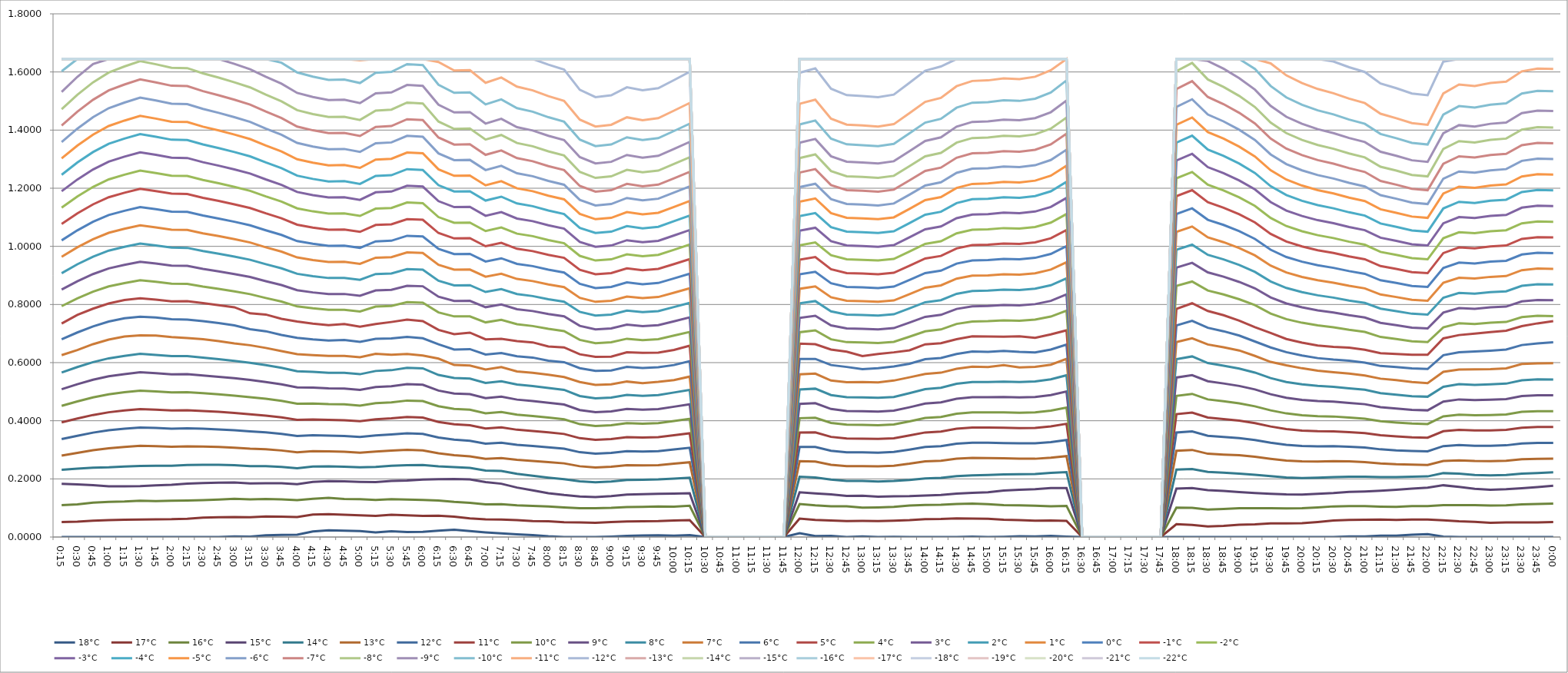
| Category | 18°C | 17°C | 16°C | 15°C | 14°C | 13°C | 12°C | 11°C | 10°C | 9°C | 8°C | 7°C | 6°C | 5°C | 4°C | 3°C | 2°C | 1°C | 0°C | -1°C | -2°C | -3°C | -4°C | -5°C | -6°C | -7°C | -8°C | -9°C | -10°C | -11°C | -12°C | -13°C | -14°C | -15°C | -16°C | -17°C | -18°C | -19°C | -20°C | -21°C | -22°C |
|---|---|---|---|---|---|---|---|---|---|---|---|---|---|---|---|---|---|---|---|---|---|---|---|---|---|---|---|---|---|---|---|---|---|---|---|---|---|---|---|---|---|
| 0.010416666666666666 | 0 | 0.052 | 0.11 | 0.183 | 0.231 | 0.28 | 0.337 | 0.394 | 0.451 | 0.509 | 0.566 | 0.626 | 0.68 | 0.734 | 0.794 | 0.851 | 0.908 | 0.964 | 1.021 | 1.077 | 1.133 | 1.19 | 1.246 | 1.303 | 1.359 | 1.416 | 1.472 | 1.531 | 1.602 | 1.644 | 1.644 | 1.644 | 1.644 | 1.644 | 1.644 | 1.644 | 1.644 | 1.644 | 1.644 | 1.644 | 1.644 |
| 0.0208333333333333 | 0 | 0.053 | 0.112 | 0.181 | 0.235 | 0.289 | 0.348 | 0.408 | 0.467 | 0.526 | 0.585 | 0.643 | 0.704 | 0.764 | 0.821 | 0.88 | 0.938 | 0.997 | 1.055 | 1.113 | 1.172 | 1.23 | 1.288 | 1.347 | 1.405 | 1.463 | 1.522 | 1.583 | 1.644 | 1.644 | 1.644 | 1.644 | 1.644 | 1.644 | 1.644 | 1.644 | 1.644 | 1.644 | 1.644 | 1.644 | 1.644 |
| 0.03125 | 0 | 0.056 | 0.118 | 0.179 | 0.239 | 0.299 | 0.359 | 0.42 | 0.48 | 0.541 | 0.602 | 0.664 | 0.725 | 0.786 | 0.844 | 0.905 | 0.965 | 1.025 | 1.085 | 1.145 | 1.205 | 1.265 | 1.324 | 1.384 | 1.444 | 1.504 | 1.564 | 1.628 | 1.644 | 1.644 | 1.644 | 1.644 | 1.644 | 1.644 | 1.644 | 1.644 | 1.644 | 1.644 | 1.644 | 1.644 | 1.644 |
| 0.0416666666666667 | 0 | 0.058 | 0.121 | 0.174 | 0.24 | 0.306 | 0.367 | 0.429 | 0.491 | 0.553 | 0.615 | 0.679 | 0.741 | 0.804 | 0.862 | 0.924 | 0.985 | 1.047 | 1.108 | 1.169 | 1.23 | 1.292 | 1.353 | 1.414 | 1.475 | 1.537 | 1.598 | 1.644 | 1.644 | 1.644 | 1.644 | 1.644 | 1.644 | 1.644 | 1.644 | 1.644 | 1.644 | 1.644 | 1.644 | 1.644 | 1.644 |
| 0.0520833333333333 | 0 | 0.06 | 0.122 | 0.175 | 0.243 | 0.31 | 0.373 | 0.435 | 0.498 | 0.561 | 0.623 | 0.69 | 0.753 | 0.815 | 0.874 | 0.936 | 0.998 | 1.06 | 1.122 | 1.184 | 1.247 | 1.309 | 1.371 | 1.433 | 1.495 | 1.557 | 1.619 | 1.644 | 1.644 | 1.644 | 1.644 | 1.644 | 1.644 | 1.644 | 1.644 | 1.644 | 1.644 | 1.644 | 1.644 | 1.644 | 1.644 |
| 0.0625 | 0 | 0.06 | 0.125 | 0.175 | 0.245 | 0.314 | 0.377 | 0.44 | 0.504 | 0.567 | 0.63 | 0.694 | 0.758 | 0.821 | 0.884 | 0.947 | 1.01 | 1.072 | 1.135 | 1.198 | 1.261 | 1.324 | 1.386 | 1.449 | 1.512 | 1.575 | 1.637 | 1.644 | 1.644 | 1.644 | 1.644 | 1.644 | 1.644 | 1.644 | 1.644 | 1.644 | 1.644 | 1.644 | 1.644 | 1.644 | 1.644 |
| 0.0729166666666667 | 0 | 0.061 | 0.124 | 0.178 | 0.245 | 0.312 | 0.375 | 0.438 | 0.501 | 0.564 | 0.627 | 0.693 | 0.755 | 0.817 | 0.878 | 0.941 | 1.003 | 1.065 | 1.128 | 1.19 | 1.252 | 1.315 | 1.377 | 1.44 | 1.502 | 1.564 | 1.627 | 1.644 | 1.644 | 1.644 | 1.644 | 1.644 | 1.644 | 1.644 | 1.644 | 1.644 | 1.644 | 1.644 | 1.644 | 1.644 | 1.644 |
| 0.0833333333333333 | 0 | 0.061 | 0.125 | 0.18 | 0.245 | 0.311 | 0.373 | 0.435 | 0.498 | 0.56 | 0.622 | 0.688 | 0.749 | 0.811 | 0.871 | 0.934 | 0.996 | 1.057 | 1.119 | 1.181 | 1.243 | 1.305 | 1.367 | 1.429 | 1.491 | 1.553 | 1.614 | 1.644 | 1.644 | 1.644 | 1.644 | 1.644 | 1.644 | 1.644 | 1.644 | 1.644 | 1.644 | 1.644 | 1.644 | 1.644 | 1.644 |
| 0.09375 | 0 | 0.063 | 0.126 | 0.184 | 0.248 | 0.312 | 0.374 | 0.436 | 0.498 | 0.56 | 0.622 | 0.685 | 0.748 | 0.811 | 0.871 | 0.933 | 0.995 | 1.057 | 1.118 | 1.18 | 1.242 | 1.304 | 1.366 | 1.428 | 1.49 | 1.551 | 1.613 | 1.644 | 1.644 | 1.644 | 1.644 | 1.644 | 1.644 | 1.644 | 1.644 | 1.644 | 1.644 | 1.644 | 1.644 | 1.644 | 1.644 |
| 0.104166666666667 | 0 | 0.067 | 0.127 | 0.186 | 0.249 | 0.311 | 0.372 | 0.434 | 0.495 | 0.556 | 0.617 | 0.68 | 0.743 | 0.805 | 0.861 | 0.923 | 0.984 | 1.045 | 1.106 | 1.167 | 1.228 | 1.289 | 1.351 | 1.412 | 1.473 | 1.534 | 1.595 | 1.644 | 1.644 | 1.644 | 1.644 | 1.644 | 1.644 | 1.644 | 1.644 | 1.644 | 1.644 | 1.644 | 1.644 | 1.644 | 1.644 |
| 0.114583333333333 | 0 | 0.068 | 0.129 | 0.187 | 0.248 | 0.31 | 0.37 | 0.431 | 0.491 | 0.551 | 0.612 | 0.674 | 0.736 | 0.798 | 0.854 | 0.914 | 0.975 | 1.035 | 1.096 | 1.156 | 1.217 | 1.278 | 1.338 | 1.399 | 1.459 | 1.52 | 1.581 | 1.644 | 1.644 | 1.644 | 1.644 | 1.644 | 1.644 | 1.644 | 1.644 | 1.644 | 1.644 | 1.644 | 1.644 | 1.644 | 1.644 |
| 0.125 | 0.002 | 0.068 | 0.131 | 0.188 | 0.247 | 0.307 | 0.367 | 0.427 | 0.487 | 0.546 | 0.606 | 0.666 | 0.728 | 0.791 | 0.845 | 0.905 | 0.965 | 1.025 | 1.085 | 1.145 | 1.205 | 1.265 | 1.325 | 1.385 | 1.445 | 1.505 | 1.565 | 1.628 | 1.644 | 1.644 | 1.644 | 1.644 | 1.644 | 1.644 | 1.644 | 1.644 | 1.644 | 1.644 | 1.644 | 1.644 | 1.644 |
| 0.135416666666667 | 0.001 | 0.068 | 0.13 | 0.184 | 0.244 | 0.304 | 0.363 | 0.422 | 0.481 | 0.54 | 0.599 | 0.66 | 0.715 | 0.77 | 0.836 | 0.895 | 0.954 | 1.013 | 1.073 | 1.132 | 1.191 | 1.25 | 1.31 | 1.369 | 1.428 | 1.488 | 1.547 | 1.609 | 1.644 | 1.644 | 1.644 | 1.644 | 1.644 | 1.644 | 1.644 | 1.644 | 1.644 | 1.644 | 1.644 | 1.644 | 1.644 |
| 0.145833333333333 | 0.006 | 0.071 | 0.131 | 0.185 | 0.244 | 0.302 | 0.36 | 0.418 | 0.476 | 0.533 | 0.591 | 0.651 | 0.708 | 0.765 | 0.822 | 0.88 | 0.939 | 0.997 | 1.055 | 1.114 | 1.172 | 1.23 | 1.289 | 1.347 | 1.405 | 1.464 | 1.522 | 1.584 | 1.644 | 1.644 | 1.644 | 1.644 | 1.644 | 1.644 | 1.644 | 1.644 | 1.644 | 1.644 | 1.644 | 1.644 | 1.644 |
| 0.15625 | 0.008 | 0.07 | 0.129 | 0.185 | 0.241 | 0.298 | 0.355 | 0.412 | 0.469 | 0.525 | 0.582 | 0.64 | 0.695 | 0.751 | 0.81 | 0.867 | 0.924 | 0.982 | 1.039 | 1.097 | 1.154 | 1.212 | 1.269 | 1.327 | 1.384 | 1.442 | 1.499 | 1.56 | 1.632 | 1.644 | 1.644 | 1.644 | 1.644 | 1.644 | 1.644 | 1.644 | 1.644 | 1.644 | 1.644 | 1.644 | 1.644 |
| 0.166666666666667 | 0.008 | 0.069 | 0.127 | 0.182 | 0.237 | 0.292 | 0.347 | 0.403 | 0.459 | 0.515 | 0.57 | 0.629 | 0.685 | 0.741 | 0.793 | 0.849 | 0.906 | 0.962 | 1.018 | 1.074 | 1.131 | 1.187 | 1.243 | 1.3 | 1.356 | 1.412 | 1.468 | 1.528 | 1.598 | 1.644 | 1.644 | 1.644 | 1.644 | 1.644 | 1.644 | 1.644 | 1.644 | 1.644 | 1.644 | 1.644 | 1.644 |
| 0.177083333333333 | 0.019 | 0.077 | 0.132 | 0.19 | 0.242 | 0.295 | 0.35 | 0.405 | 0.459 | 0.514 | 0.568 | 0.626 | 0.68 | 0.734 | 0.787 | 0.842 | 0.897 | 0.953 | 1.009 | 1.065 | 1.12 | 1.176 | 1.232 | 1.288 | 1.344 | 1.399 | 1.455 | 1.514 | 1.584 | 1.644 | 1.644 | 1.644 | 1.644 | 1.644 | 1.644 | 1.644 | 1.644 | 1.644 | 1.644 | 1.644 | 1.644 |
| 0.1875 | 0.023 | 0.079 | 0.135 | 0.192 | 0.243 | 0.295 | 0.349 | 0.403 | 0.457 | 0.511 | 0.565 | 0.623 | 0.676 | 0.729 | 0.782 | 0.836 | 0.891 | 0.946 | 1.002 | 1.057 | 1.113 | 1.168 | 1.223 | 1.279 | 1.334 | 1.39 | 1.445 | 1.503 | 1.573 | 1.644 | 1.644 | 1.644 | 1.644 | 1.644 | 1.644 | 1.644 | 1.644 | 1.644 | 1.644 | 1.644 | 1.644 |
| 0.197916666666667 | 0.022 | 0.077 | 0.131 | 0.191 | 0.242 | 0.293 | 0.348 | 0.402 | 0.456 | 0.511 | 0.565 | 0.623 | 0.678 | 0.733 | 0.782 | 0.836 | 0.892 | 0.947 | 1.003 | 1.058 | 1.113 | 1.169 | 1.224 | 1.28 | 1.335 | 1.391 | 1.446 | 1.504 | 1.574 | 1.644 | 1.644 | 1.644 | 1.644 | 1.644 | 1.644 | 1.644 | 1.644 | 1.644 | 1.644 | 1.644 | 1.644 |
| 0.208333333333333 | 0.02 | 0.075 | 0.13 | 0.19 | 0.24 | 0.29 | 0.344 | 0.398 | 0.452 | 0.506 | 0.56 | 0.619 | 0.671 | 0.724 | 0.776 | 0.83 | 0.885 | 0.94 | 0.995 | 1.05 | 1.105 | 1.16 | 1.215 | 1.27 | 1.325 | 1.38 | 1.435 | 1.493 | 1.562 | 1.64 | 1.644 | 1.644 | 1.644 | 1.644 | 1.644 | 1.644 | 1.644 | 1.644 | 1.644 | 1.644 | 1.644 |
| 0.21875 | 0.016 | 0.072 | 0.128 | 0.189 | 0.241 | 0.294 | 0.35 | 0.405 | 0.46 | 0.516 | 0.571 | 0.631 | 0.682 | 0.733 | 0.793 | 0.849 | 0.905 | 0.961 | 1.017 | 1.074 | 1.13 | 1.186 | 1.242 | 1.299 | 1.355 | 1.411 | 1.467 | 1.527 | 1.597 | 1.644 | 1.644 | 1.644 | 1.644 | 1.644 | 1.644 | 1.644 | 1.644 | 1.644 | 1.644 | 1.644 | 1.644 |
| 0.229166666666667 | 0.02 | 0.077 | 0.13 | 0.193 | 0.245 | 0.298 | 0.353 | 0.408 | 0.463 | 0.519 | 0.574 | 0.627 | 0.683 | 0.74 | 0.795 | 0.85 | 0.907 | 0.963 | 1.019 | 1.076 | 1.132 | 1.188 | 1.245 | 1.301 | 1.358 | 1.414 | 1.47 | 1.53 | 1.6 | 1.644 | 1.644 | 1.644 | 1.644 | 1.644 | 1.644 | 1.644 | 1.644 | 1.644 | 1.644 | 1.644 | 1.644 |
| 0.239583333333333 | 0.017 | 0.075 | 0.129 | 0.194 | 0.247 | 0.3 | 0.357 | 0.413 | 0.469 | 0.526 | 0.582 | 0.629 | 0.689 | 0.748 | 0.808 | 0.864 | 0.922 | 0.979 | 1.036 | 1.094 | 1.151 | 1.208 | 1.266 | 1.323 | 1.38 | 1.437 | 1.495 | 1.555 | 1.627 | 1.644 | 1.644 | 1.644 | 1.644 | 1.644 | 1.644 | 1.644 | 1.644 | 1.644 | 1.644 | 1.644 | 1.644 |
| 0.25 | 0.018 | 0.073 | 0.127 | 0.197 | 0.248 | 0.298 | 0.355 | 0.411 | 0.468 | 0.524 | 0.58 | 0.625 | 0.684 | 0.743 | 0.806 | 0.863 | 0.92 | 0.977 | 1.034 | 1.091 | 1.149 | 1.206 | 1.263 | 1.32 | 1.377 | 1.435 | 1.492 | 1.552 | 1.624 | 1.644 | 1.644 | 1.644 | 1.644 | 1.644 | 1.644 | 1.644 | 1.644 | 1.644 | 1.644 | 1.644 | 1.644 |
| 0.260416666666667 | 0.022 | 0.073 | 0.126 | 0.199 | 0.243 | 0.288 | 0.342 | 0.396 | 0.45 | 0.504 | 0.558 | 0.614 | 0.663 | 0.713 | 0.773 | 0.827 | 0.882 | 0.936 | 0.991 | 1.046 | 1.101 | 1.156 | 1.21 | 1.265 | 1.32 | 1.375 | 1.43 | 1.487 | 1.556 | 1.634 | 1.644 | 1.644 | 1.644 | 1.644 | 1.644 | 1.644 | 1.644 | 1.644 | 1.644 | 1.644 | 1.644 |
| 0.270833333333333 | 0.025 | 0.07 | 0.121 | 0.2 | 0.24 | 0.282 | 0.335 | 0.388 | 0.441 | 0.494 | 0.547 | 0.592 | 0.645 | 0.698 | 0.759 | 0.812 | 0.866 | 0.92 | 0.974 | 1.027 | 1.081 | 1.135 | 1.189 | 1.243 | 1.296 | 1.35 | 1.404 | 1.461 | 1.528 | 1.605 | 1.644 | 1.644 | 1.644 | 1.644 | 1.644 | 1.644 | 1.644 | 1.644 | 1.644 | 1.644 | 1.644 |
| 0.28125 | 0.02 | 0.064 | 0.117 | 0.198 | 0.238 | 0.278 | 0.331 | 0.385 | 0.438 | 0.492 | 0.545 | 0.59 | 0.646 | 0.703 | 0.759 | 0.813 | 0.867 | 0.92 | 0.974 | 1.028 | 1.082 | 1.136 | 1.19 | 1.244 | 1.297 | 1.351 | 1.405 | 1.462 | 1.53 | 1.606 | 1.644 | 1.644 | 1.644 | 1.644 | 1.644 | 1.644 | 1.644 | 1.644 | 1.644 | 1.644 | 1.644 |
| 0.291666666666667 | 0.016 | 0.061 | 0.113 | 0.189 | 0.229 | 0.269 | 0.321 | 0.373 | 0.426 | 0.478 | 0.53 | 0.576 | 0.628 | 0.68 | 0.739 | 0.791 | 0.843 | 0.896 | 0.948 | 1 | 1.053 | 1.105 | 1.158 | 1.21 | 1.262 | 1.315 | 1.367 | 1.423 | 1.488 | 1.563 | 1.644 | 1.644 | 1.644 | 1.644 | 1.644 | 1.644 | 1.644 | 1.644 | 1.644 | 1.644 | 1.644 |
| 0.302083333333333 | 0.012 | 0.06 | 0.113 | 0.183 | 0.227 | 0.271 | 0.324 | 0.377 | 0.43 | 0.483 | 0.536 | 0.584 | 0.633 | 0.682 | 0.747 | 0.8 | 0.853 | 0.906 | 0.959 | 1.012 | 1.065 | 1.118 | 1.171 | 1.224 | 1.277 | 1.33 | 1.383 | 1.439 | 1.506 | 1.581 | 1.644 | 1.644 | 1.644 | 1.644 | 1.644 | 1.644 | 1.644 | 1.644 | 1.644 | 1.644 | 1.644 |
| 0.3125 | 0.01 | 0.058 | 0.109 | 0.17 | 0.218 | 0.265 | 0.317 | 0.369 | 0.421 | 0.473 | 0.525 | 0.57 | 0.622 | 0.674 | 0.732 | 0.784 | 0.836 | 0.888 | 0.94 | 0.992 | 1.044 | 1.096 | 1.148 | 1.2 | 1.252 | 1.304 | 1.355 | 1.41 | 1.475 | 1.549 | 1.644 | 1.644 | 1.644 | 1.644 | 1.644 | 1.644 | 1.644 | 1.644 | 1.644 | 1.644 | 1.644 |
| 0.322916666666667 | 0.007 | 0.055 | 0.107 | 0.161 | 0.211 | 0.262 | 0.313 | 0.365 | 0.416 | 0.468 | 0.519 | 0.565 | 0.617 | 0.67 | 0.726 | 0.777 | 0.829 | 0.881 | 0.932 | 0.984 | 1.035 | 1.087 | 1.138 | 1.19 | 1.241 | 1.293 | 1.344 | 1.399 | 1.463 | 1.537 | 1.644 | 1.644 | 1.644 | 1.644 | 1.644 | 1.644 | 1.644 | 1.644 | 1.644 | 1.644 | 1.644 |
| 0.333333333333333 | 0.002 | 0.054 | 0.105 | 0.151 | 0.204 | 0.258 | 0.309 | 0.36 | 0.411 | 0.462 | 0.513 | 0.558 | 0.607 | 0.655 | 0.716 | 0.767 | 0.818 | 0.869 | 0.92 | 0.971 | 1.022 | 1.073 | 1.123 | 1.174 | 1.225 | 1.276 | 1.327 | 1.381 | 1.444 | 1.517 | 1.625 | 1.644 | 1.644 | 1.644 | 1.644 | 1.644 | 1.644 | 1.644 | 1.644 | 1.644 | 1.644 |
| 0.34375 | 0 | 0.051 | 0.102 | 0.144 | 0.199 | 0.253 | 0.304 | 0.355 | 0.405 | 0.456 | 0.506 | 0.55 | 0.601 | 0.652 | 0.709 | 0.759 | 0.809 | 0.86 | 0.91 | 0.96 | 1.011 | 1.061 | 1.111 | 1.162 | 1.212 | 1.262 | 1.313 | 1.366 | 1.429 | 1.5 | 1.608 | 1.644 | 1.644 | 1.644 | 1.644 | 1.644 | 1.644 | 1.644 | 1.644 | 1.644 | 1.644 |
| 0.354166666666667 | 0 | 0.05 | 0.099 | 0.14 | 0.192 | 0.243 | 0.292 | 0.34 | 0.388 | 0.437 | 0.485 | 0.533 | 0.581 | 0.629 | 0.678 | 0.727 | 0.775 | 0.823 | 0.871 | 0.919 | 0.967 | 1.015 | 1.064 | 1.112 | 1.16 | 1.208 | 1.256 | 1.307 | 1.367 | 1.436 | 1.539 | 1.644 | 1.644 | 1.644 | 1.644 | 1.644 | 1.644 | 1.644 | 1.644 | 1.644 | 1.644 |
| 0.364583333333333 | 0 | 0.049 | 0.099 | 0.138 | 0.189 | 0.239 | 0.287 | 0.334 | 0.382 | 0.429 | 0.477 | 0.523 | 0.572 | 0.62 | 0.667 | 0.714 | 0.762 | 0.809 | 0.857 | 0.904 | 0.951 | 0.999 | 1.046 | 1.093 | 1.141 | 1.188 | 1.235 | 1.285 | 1.345 | 1.412 | 1.513 | 1.644 | 1.644 | 1.644 | 1.644 | 1.644 | 1.644 | 1.644 | 1.644 | 1.644 | 1.644 |
| 0.375 | 0.001 | 0.051 | 0.1 | 0.141 | 0.191 | 0.242 | 0.289 | 0.337 | 0.384 | 0.432 | 0.48 | 0.525 | 0.573 | 0.621 | 0.67 | 0.718 | 0.765 | 0.813 | 0.86 | 0.908 | 0.955 | 1.003 | 1.05 | 1.098 | 1.146 | 1.193 | 1.241 | 1.291 | 1.351 | 1.418 | 1.52 | 1.644 | 1.644 | 1.644 | 1.644 | 1.644 | 1.644 | 1.644 | 1.644 | 1.644 | 1.644 |
| 0.385416666666667 | 0.004 | 0.054 | 0.103 | 0.146 | 0.196 | 0.247 | 0.295 | 0.344 | 0.392 | 0.44 | 0.489 | 0.535 | 0.585 | 0.636 | 0.682 | 0.731 | 0.779 | 0.827 | 0.876 | 0.924 | 0.973 | 1.021 | 1.07 | 1.118 | 1.166 | 1.215 | 1.263 | 1.314 | 1.375 | 1.444 | 1.547 | 1.644 | 1.644 | 1.644 | 1.644 | 1.644 | 1.644 | 1.644 | 1.644 | 1.644 | 1.644 |
| 0.395833333333333 | 0.005 | 0.054 | 0.104 | 0.147 | 0.197 | 0.246 | 0.294 | 0.342 | 0.39 | 0.438 | 0.486 | 0.53 | 0.582 | 0.634 | 0.678 | 0.726 | 0.774 | 0.822 | 0.87 | 0.918 | 0.966 | 1.014 | 1.062 | 1.11 | 1.158 | 1.206 | 1.255 | 1.305 | 1.366 | 1.434 | 1.537 | 1.644 | 1.644 | 1.644 | 1.644 | 1.644 | 1.644 | 1.644 | 1.644 | 1.644 | 1.644 |
| 0.40625 | 0.006 | 0.055 | 0.105 | 0.149 | 0.198 | 0.247 | 0.296 | 0.344 | 0.392 | 0.44 | 0.488 | 0.534 | 0.584 | 0.634 | 0.681 | 0.729 | 0.777 | 0.826 | 0.874 | 0.922 | 0.971 | 1.019 | 1.067 | 1.116 | 1.164 | 1.212 | 1.261 | 1.312 | 1.372 | 1.441 | 1.544 | 1.644 | 1.644 | 1.644 | 1.644 | 1.644 | 1.644 | 1.644 | 1.644 | 1.644 | 1.644 |
| 0.416666666666667 | 0.005 | 0.057 | 0.104 | 0.15 | 0.201 | 0.252 | 0.301 | 0.35 | 0.399 | 0.448 | 0.497 | 0.54 | 0.592 | 0.644 | 0.693 | 0.742 | 0.791 | 0.841 | 0.89 | 0.939 | 0.988 | 1.037 | 1.087 | 1.136 | 1.185 | 1.234 | 1.283 | 1.335 | 1.397 | 1.467 | 1.572 | 1.644 | 1.644 | 1.644 | 1.644 | 1.644 | 1.644 | 1.644 | 1.644 | 1.644 | 1.644 |
| 0.427083333333333 | 0.006 | 0.058 | 0.108 | 0.151 | 0.204 | 0.257 | 0.307 | 0.357 | 0.407 | 0.457 | 0.506 | 0.552 | 0.605 | 0.658 | 0.706 | 0.756 | 0.806 | 0.856 | 0.906 | 0.956 | 1.006 | 1.056 | 1.106 | 1.156 | 1.206 | 1.256 | 1.306 | 1.359 | 1.422 | 1.493 | 1.6 | 1.644 | 1.644 | 1.644 | 1.644 | 1.644 | 1.644 | 1.644 | 1.644 | 1.644 | 1.644 |
| 0.4375 | 0 | 0 | 0 | 0 | 0 | 0 | 0 | 0 | 0 | 0 | 0 | 0 | 0 | 0 | 0 | 0 | 0 | 0 | 0 | 0 | 0 | 0 | 0 | 0 | 0 | 0 | 0 | 0 | 0 | 0 | 0 | 0 | 0 | 0 | 0 | 0 | 0 | 0 | 0 | 0 | 0 |
| 0.447916666666667 | 0 | 0 | 0 | 0 | 0 | 0 | 0 | 0 | 0 | 0 | 0 | 0 | 0 | 0 | 0 | 0 | 0 | 0 | 0 | 0 | 0 | 0 | 0 | 0 | 0 | 0 | 0 | 0 | 0 | 0 | 0 | 0 | 0 | 0 | 0 | 0 | 0 | 0 | 0 | 0 | 0 |
| 0.458333333333333 | 0 | 0 | 0 | 0 | 0 | 0 | 0 | 0 | 0 | 0 | 0 | 0 | 0 | 0 | 0 | 0 | 0 | 0 | 0 | 0 | 0 | 0 | 0 | 0 | 0 | 0 | 0 | 0 | 0 | 0 | 0 | 0 | 0 | 0 | 0 | 0 | 0 | 0 | 0 | 0 | 0 |
| 0.46875 | 0 | 0 | 0 | 0 | 0 | 0 | 0 | 0 | 0 | 0 | 0 | 0 | 0 | 0 | 0 | 0 | 0 | 0 | 0 | 0 | 0 | 0 | 0 | 0 | 0 | 0 | 0 | 0 | 0 | 0 | 0 | 0 | 0 | 0 | 0 | 0 | 0 | 0 | 0 | 0 | 0 |
| 0.479166666666667 | 0 | 0 | 0 | 0 | 0 | 0 | 0 | 0 | 0 | 0 | 0 | 0 | 0 | 0 | 0 | 0 | 0 | 0 | 0 | 0 | 0 | 0 | 0 | 0 | 0 | 0 | 0 | 0 | 0 | 0 | 0 | 0 | 0 | 0 | 0 | 0 | 0 | 0 | 0 | 0 | 0 |
| 0.489583333333333 | 0 | 0 | 0 | 0 | 0 | 0 | 0 | 0 | 0 | 0 | 0 | 0 | 0 | 0 | 0 | 0 | 0 | 0 | 0 | 0 | 0 | 0 | 0 | 0 | 0 | 0 | 0 | 0 | 0 | 0 | 0 | 0 | 0 | 0 | 0 | 0 | 0 | 0 | 0 | 0 | 0 |
| 0.5 | 0.013 | 0.064 | 0.113 | 0.154 | 0.207 | 0.261 | 0.31 | 0.359 | 0.409 | 0.458 | 0.507 | 0.56 | 0.613 | 0.665 | 0.705 | 0.754 | 0.804 | 0.854 | 0.904 | 0.954 | 1.004 | 1.054 | 1.104 | 1.154 | 1.204 | 1.254 | 1.304 | 1.357 | 1.419 | 1.49 | 1.597 | 1.644 | 1.644 | 1.644 | 1.644 | 1.644 | 1.644 | 1.644 | 1.644 | 1.644 | 1.644 |
| 0.510416666666667 | 0.003 | 0.059 | 0.109 | 0.15 | 0.205 | 0.26 | 0.31 | 0.36 | 0.41 | 0.46 | 0.51 | 0.562 | 0.613 | 0.663 | 0.711 | 0.761 | 0.812 | 0.862 | 0.913 | 0.963 | 1.014 | 1.064 | 1.114 | 1.165 | 1.215 | 1.266 | 1.316 | 1.37 | 1.433 | 1.505 | 1.612 | 1.644 | 1.644 | 1.644 | 1.644 | 1.644 | 1.644 | 1.644 | 1.644 | 1.644 | 1.644 |
| 0.520833333333333 | 0.004 | 0.057 | 0.106 | 0.147 | 0.198 | 0.249 | 0.297 | 0.345 | 0.393 | 0.441 | 0.488 | 0.539 | 0.592 | 0.645 | 0.68 | 0.728 | 0.776 | 0.825 | 0.873 | 0.921 | 0.97 | 1.018 | 1.066 | 1.114 | 1.163 | 1.211 | 1.259 | 1.31 | 1.371 | 1.439 | 1.542 | 1.644 | 1.644 | 1.644 | 1.644 | 1.644 | 1.644 | 1.644 | 1.644 | 1.644 | 1.644 |
| 0.53125 | 0 | 0.055 | 0.106 | 0.141 | 0.193 | 0.244 | 0.292 | 0.339 | 0.386 | 0.434 | 0.481 | 0.533 | 0.585 | 0.638 | 0.67 | 0.718 | 0.765 | 0.813 | 0.861 | 0.908 | 0.956 | 1.003 | 1.051 | 1.098 | 1.146 | 1.194 | 1.241 | 1.291 | 1.351 | 1.419 | 1.52 | 1.644 | 1.644 | 1.644 | 1.644 | 1.644 | 1.644 | 1.644 | 1.644 | 1.644 | 1.644 |
| 0.541666666666667 | 0.002 | 0.055 | 0.101 | 0.142 | 0.193 | 0.244 | 0.291 | 0.339 | 0.386 | 0.433 | 0.48 | 0.533 | 0.578 | 0.622 | 0.669 | 0.716 | 0.764 | 0.811 | 0.859 | 0.906 | 0.954 | 1.001 | 1.049 | 1.096 | 1.144 | 1.191 | 1.239 | 1.289 | 1.348 | 1.416 | 1.517 | 1.644 | 1.644 | 1.644 | 1.644 | 1.644 | 1.644 | 1.644 | 1.644 | 1.644 | 1.644 |
| 0.552083333333333 | 0 | 0.055 | 0.102 | 0.139 | 0.191 | 0.243 | 0.29 | 0.337 | 0.385 | 0.432 | 0.479 | 0.532 | 0.581 | 0.63 | 0.667 | 0.715 | 0.762 | 0.809 | 0.857 | 0.904 | 0.951 | 0.999 | 1.046 | 1.093 | 1.141 | 1.188 | 1.236 | 1.285 | 1.345 | 1.412 | 1.513 | 1.644 | 1.644 | 1.644 | 1.644 | 1.644 | 1.644 | 1.644 | 1.644 | 1.644 | 1.644 |
| 0.5625 | 0.001 | 0.056 | 0.104 | 0.14 | 0.193 | 0.245 | 0.293 | 0.34 | 0.387 | 0.435 | 0.482 | 0.538 | 0.587 | 0.635 | 0.671 | 0.719 | 0.766 | 0.814 | 0.862 | 0.909 | 0.957 | 1.004 | 1.052 | 1.1 | 1.147 | 1.195 | 1.243 | 1.293 | 1.353 | 1.42 | 1.522 | 1.644 | 1.644 | 1.644 | 1.644 | 1.644 | 1.644 | 1.644 | 1.644 | 1.644 | 1.644 |
| 0.572916666666667 | 0 | 0.058 | 0.108 | 0.141 | 0.197 | 0.252 | 0.301 | 0.349 | 0.398 | 0.446 | 0.495 | 0.549 | 0.596 | 0.642 | 0.689 | 0.738 | 0.787 | 0.836 | 0.885 | 0.933 | 0.982 | 1.031 | 1.08 | 1.129 | 1.178 | 1.227 | 1.276 | 1.327 | 1.389 | 1.458 | 1.563 | 1.644 | 1.644 | 1.644 | 1.644 | 1.644 | 1.644 | 1.644 | 1.644 | 1.644 | 1.644 |
| 0.583333333333333 | 0 | 0.062 | 0.11 | 0.142 | 0.202 | 0.26 | 0.31 | 0.36 | 0.41 | 0.459 | 0.509 | 0.561 | 0.612 | 0.663 | 0.708 | 0.757 | 0.808 | 0.858 | 0.908 | 0.958 | 1.008 | 1.059 | 1.109 | 1.159 | 1.209 | 1.26 | 1.31 | 1.363 | 1.426 | 1.497 | 1.604 | 1.644 | 1.644 | 1.644 | 1.644 | 1.644 | 1.644 | 1.644 | 1.644 | 1.644 | 1.644 |
| 0.59375 | 0 | 0.062 | 0.111 | 0.145 | 0.204 | 0.262 | 0.313 | 0.363 | 0.413 | 0.463 | 0.513 | 0.565 | 0.616 | 0.667 | 0.714 | 0.764 | 0.815 | 0.866 | 0.916 | 0.967 | 1.018 | 1.068 | 1.119 | 1.17 | 1.22 | 1.271 | 1.322 | 1.375 | 1.439 | 1.511 | 1.619 | 1.644 | 1.644 | 1.644 | 1.644 | 1.644 | 1.644 | 1.644 | 1.644 | 1.644 | 1.644 |
| 0.604166666666667 | 0 | 0.064 | 0.113 | 0.149 | 0.21 | 0.27 | 0.321 | 0.373 | 0.424 | 0.476 | 0.527 | 0.579 | 0.63 | 0.681 | 0.733 | 0.785 | 0.837 | 0.889 | 0.941 | 0.993 | 1.045 | 1.097 | 1.149 | 1.201 | 1.253 | 1.305 | 1.357 | 1.412 | 1.477 | 1.551 | 1.644 | 1.644 | 1.644 | 1.644 | 1.644 | 1.644 | 1.644 | 1.644 | 1.644 | 1.644 | 1.644 |
| 0.614583333333333 | 0.001 | 0.063 | 0.115 | 0.152 | 0.212 | 0.272 | 0.324 | 0.376 | 0.429 | 0.481 | 0.533 | 0.586 | 0.638 | 0.691 | 0.742 | 0.794 | 0.846 | 0.899 | 0.952 | 1.004 | 1.057 | 1.11 | 1.162 | 1.215 | 1.267 | 1.32 | 1.373 | 1.428 | 1.494 | 1.569 | 1.644 | 1.644 | 1.644 | 1.644 | 1.644 | 1.644 | 1.644 | 1.644 | 1.644 | 1.644 | 1.644 |
| 0.625 | 0 | 0.063 | 0.113 | 0.154 | 0.213 | 0.272 | 0.324 | 0.376 | 0.429 | 0.481 | 0.533 | 0.585 | 0.637 | 0.69 | 0.743 | 0.795 | 0.848 | 0.9 | 0.953 | 1.006 | 1.058 | 1.111 | 1.164 | 1.216 | 1.269 | 1.322 | 1.374 | 1.43 | 1.496 | 1.571 | 1.644 | 1.644 | 1.644 | 1.644 | 1.644 | 1.644 | 1.644 | 1.644 | 1.644 | 1.644 | 1.644 |
| 0.635416666666667 | 0.001 | 0.06 | 0.11 | 0.16 | 0.215 | 0.271 | 0.323 | 0.376 | 0.429 | 0.482 | 0.534 | 0.592 | 0.64 | 0.689 | 0.746 | 0.798 | 0.851 | 0.904 | 0.957 | 1.01 | 1.063 | 1.116 | 1.169 | 1.222 | 1.275 | 1.327 | 1.38 | 1.436 | 1.503 | 1.578 | 1.644 | 1.644 | 1.644 | 1.644 | 1.644 | 1.644 | 1.644 | 1.644 | 1.644 | 1.644 | 1.644 |
| 0.645833333333333 | 0.003 | 0.058 | 0.109 | 0.163 | 0.216 | 0.269 | 0.322 | 0.375 | 0.428 | 0.48 | 0.533 | 0.584 | 0.637 | 0.691 | 0.744 | 0.797 | 0.85 | 0.903 | 0.956 | 1.008 | 1.061 | 1.114 | 1.167 | 1.22 | 1.273 | 1.325 | 1.378 | 1.434 | 1.5 | 1.576 | 1.644 | 1.644 | 1.644 | 1.644 | 1.644 | 1.644 | 1.644 | 1.644 | 1.644 | 1.644 | 1.644 |
| 0.65625 | 0.002 | 0.056 | 0.108 | 0.165 | 0.217 | 0.269 | 0.322 | 0.376 | 0.429 | 0.482 | 0.535 | 0.585 | 0.635 | 0.685 | 0.748 | 0.801 | 0.854 | 0.907 | 0.961 | 1.014 | 1.067 | 1.12 | 1.173 | 1.226 | 1.279 | 1.332 | 1.385 | 1.441 | 1.508 | 1.584 | 1.644 | 1.644 | 1.644 | 1.644 | 1.644 | 1.644 | 1.644 | 1.644 | 1.644 | 1.644 | 1.644 |
| 0.666666666666667 | 0.004 | 0.057 | 0.106 | 0.168 | 0.22 | 0.273 | 0.327 | 0.381 | 0.435 | 0.489 | 0.543 | 0.593 | 0.645 | 0.697 | 0.758 | 0.812 | 0.866 | 0.92 | 0.974 | 1.028 | 1.082 | 1.136 | 1.189 | 1.243 | 1.297 | 1.351 | 1.405 | 1.462 | 1.529 | 1.606 | 1.644 | 1.644 | 1.644 | 1.644 | 1.644 | 1.644 | 1.644 | 1.644 | 1.644 | 1.644 | 1.644 |
| 0.677083333333333 | 0.002 | 0.056 | 0.107 | 0.169 | 0.223 | 0.278 | 0.334 | 0.39 | 0.445 | 0.501 | 0.556 | 0.613 | 0.662 | 0.711 | 0.779 | 0.835 | 0.89 | 0.945 | 1.001 | 1.056 | 1.111 | 1.167 | 1.222 | 1.277 | 1.333 | 1.388 | 1.443 | 1.502 | 1.571 | 1.644 | 1.644 | 1.644 | 1.644 | 1.644 | 1.644 | 1.644 | 1.644 | 1.644 | 1.644 | 1.644 | 1.644 |
| 0.6875 | 0 | 0 | 0 | 0 | 0 | 0 | 0 | 0 | 0 | 0 | 0 | 0 | 0 | 0 | 0 | 0 | 0 | 0 | 0 | 0 | 0 | 0 | 0 | 0 | 0 | 0 | 0 | 0 | 0 | 0 | 0 | 0 | 0 | 0 | 0 | 0 | 0 | 0 | 0 | 0 | 0 |
| 0.697916666666667 | 0 | 0 | 0 | 0 | 0 | 0 | 0 | 0 | 0 | 0 | 0 | 0 | 0 | 0 | 0 | 0 | 0 | 0 | 0 | 0 | 0 | 0 | 0 | 0 | 0 | 0 | 0 | 0 | 0 | 0 | 0 | 0 | 0 | 0 | 0 | 0 | 0 | 0 | 0 | 0 | 0 |
| 0.708333333333333 | 0 | 0 | 0 | 0 | 0 | 0 | 0 | 0 | 0 | 0 | 0 | 0 | 0 | 0 | 0 | 0 | 0 | 0 | 0 | 0 | 0 | 0 | 0 | 0 | 0 | 0 | 0 | 0 | 0 | 0 | 0 | 0 | 0 | 0 | 0 | 0 | 0 | 0 | 0 | 0 | 0 |
| 0.71875 | 0 | 0 | 0 | 0 | 0 | 0 | 0 | 0 | 0 | 0 | 0 | 0 | 0 | 0 | 0 | 0 | 0 | 0 | 0 | 0 | 0 | 0 | 0 | 0 | 0 | 0 | 0 | 0 | 0 | 0 | 0 | 0 | 0 | 0 | 0 | 0 | 0 | 0 | 0 | 0 | 0 |
| 0.729166666666667 | 0 | 0 | 0 | 0 | 0 | 0 | 0 | 0 | 0 | 0 | 0 | 0 | 0 | 0 | 0 | 0 | 0 | 0 | 0 | 0 | 0 | 0 | 0 | 0 | 0 | 0 | 0 | 0 | 0 | 0 | 0 | 0 | 0 | 0 | 0 | 0 | 0 | 0 | 0 | 0 | 0 |
| 0.739583333333333 | 0 | 0 | 0 | 0 | 0 | 0 | 0 | 0 | 0 | 0 | 0 | 0 | 0 | 0 | 0 | 0 | 0 | 0 | 0 | 0 | 0 | 0 | 0 | 0 | 0 | 0 | 0 | 0 | 0 | 0 | 0 | 0 | 0 | 0 | 0 | 0 | 0 | 0 | 0 | 0 | 0 |
| 0.75 | 0 | 0.044 | 0.101 | 0.167 | 0.232 | 0.297 | 0.359 | 0.423 | 0.486 | 0.549 | 0.612 | 0.671 | 0.728 | 0.785 | 0.864 | 0.927 | 0.988 | 1.05 | 1.111 | 1.173 | 1.234 | 1.295 | 1.357 | 1.418 | 1.48 | 1.541 | 1.603 | 1.644 | 1.644 | 1.644 | 1.644 | 1.644 | 1.644 | 1.644 | 1.644 | 1.644 | 1.644 | 1.644 | 1.644 | 1.644 | 1.644 |
| 0.760416666666667 | 0 | 0.041 | 0.1 | 0.168 | 0.234 | 0.3 | 0.364 | 0.428 | 0.492 | 0.557 | 0.621 | 0.684 | 0.744 | 0.804 | 0.879 | 0.943 | 1.006 | 1.068 | 1.131 | 1.193 | 1.256 | 1.318 | 1.381 | 1.443 | 1.506 | 1.568 | 1.631 | 1.644 | 1.644 | 1.644 | 1.644 | 1.644 | 1.644 | 1.644 | 1.644 | 1.644 | 1.644 | 1.644 | 1.644 | 1.644 | 1.644 |
| 0.770833333333333 | 0 | 0.036 | 0.094 | 0.161 | 0.224 | 0.287 | 0.348 | 0.411 | 0.473 | 0.536 | 0.598 | 0.662 | 0.72 | 0.778 | 0.848 | 0.91 | 0.971 | 1.031 | 1.091 | 1.152 | 1.212 | 1.273 | 1.333 | 1.393 | 1.454 | 1.514 | 1.574 | 1.638 | 1.644 | 1.644 | 1.644 | 1.644 | 1.644 | 1.644 | 1.644 | 1.644 | 1.644 | 1.644 | 1.644 | 1.644 | 1.644 |
| 0.78125 | 0 | 0.038 | 0.096 | 0.158 | 0.221 | 0.284 | 0.344 | 0.406 | 0.467 | 0.528 | 0.59 | 0.653 | 0.708 | 0.763 | 0.835 | 0.896 | 0.955 | 1.014 | 1.074 | 1.133 | 1.192 | 1.252 | 1.311 | 1.371 | 1.43 | 1.489 | 1.549 | 1.611 | 1.644 | 1.644 | 1.644 | 1.644 | 1.644 | 1.644 | 1.644 | 1.644 | 1.644 | 1.644 | 1.644 | 1.644 | 1.644 |
| 0.791666666666667 | 0 | 0.042 | 0.099 | 0.155 | 0.218 | 0.281 | 0.341 | 0.4 | 0.46 | 0.52 | 0.579 | 0.642 | 0.693 | 0.744 | 0.818 | 0.878 | 0.936 | 0.994 | 1.052 | 1.11 | 1.168 | 1.227 | 1.285 | 1.343 | 1.401 | 1.459 | 1.518 | 1.579 | 1.644 | 1.644 | 1.644 | 1.644 | 1.644 | 1.644 | 1.644 | 1.644 | 1.644 | 1.644 | 1.644 | 1.644 | 1.644 |
| 0.802083333333333 | 0 | 0.044 | 0.099 | 0.151 | 0.214 | 0.276 | 0.334 | 0.392 | 0.45 | 0.508 | 0.566 | 0.623 | 0.673 | 0.722 | 0.798 | 0.856 | 0.912 | 0.969 | 1.026 | 1.082 | 1.139 | 1.196 | 1.253 | 1.309 | 1.366 | 1.423 | 1.479 | 1.539 | 1.61 | 1.644 | 1.644 | 1.644 | 1.644 | 1.644 | 1.644 | 1.644 | 1.644 | 1.644 | 1.644 | 1.644 | 1.644 |
| 0.8125 | 0 | 0.047 | 0.099 | 0.149 | 0.209 | 0.269 | 0.325 | 0.38 | 0.436 | 0.491 | 0.547 | 0.602 | 0.652 | 0.702 | 0.769 | 0.825 | 0.879 | 0.934 | 0.988 | 1.043 | 1.098 | 1.152 | 1.207 | 1.262 | 1.316 | 1.371 | 1.426 | 1.483 | 1.552 | 1.63 | 1.644 | 1.644 | 1.644 | 1.644 | 1.644 | 1.644 | 1.644 | 1.644 | 1.644 | 1.644 | 1.644 |
| 0.822916666666667 | 0 | 0.047 | 0.098 | 0.147 | 0.205 | 0.263 | 0.317 | 0.371 | 0.425 | 0.479 | 0.533 | 0.591 | 0.636 | 0.681 | 0.75 | 0.804 | 0.857 | 0.91 | 0.963 | 1.017 | 1.07 | 1.123 | 1.176 | 1.23 | 1.283 | 1.336 | 1.39 | 1.446 | 1.513 | 1.588 | 1.644 | 1.644 | 1.644 | 1.644 | 1.644 | 1.644 | 1.644 | 1.644 | 1.644 | 1.644 | 1.644 |
| 0.833333333333333 | 0 | 0.048 | 0.099 | 0.146 | 0.203 | 0.26 | 0.313 | 0.366 | 0.419 | 0.472 | 0.525 | 0.581 | 0.625 | 0.669 | 0.737 | 0.79 | 0.843 | 0.895 | 0.947 | 1 | 1.052 | 1.104 | 1.157 | 1.209 | 1.262 | 1.314 | 1.366 | 1.421 | 1.487 | 1.562 | 1.644 | 1.644 | 1.644 | 1.644 | 1.644 | 1.644 | 1.644 | 1.644 | 1.644 | 1.644 | 1.644 |
| 0.84375 | 0 | 0.052 | 0.102 | 0.149 | 0.204 | 0.26 | 0.312 | 0.364 | 0.416 | 0.468 | 0.52 | 0.572 | 0.616 | 0.659 | 0.728 | 0.78 | 0.832 | 0.883 | 0.935 | 0.987 | 1.038 | 1.09 | 1.142 | 1.193 | 1.245 | 1.297 | 1.349 | 1.403 | 1.468 | 1.542 | 1.644 | 1.644 | 1.644 | 1.644 | 1.644 | 1.644 | 1.644 | 1.644 | 1.644 | 1.644 | 1.644 |
| 0.854166666666667 | 0 | 0.057 | 0.105 | 0.151 | 0.206 | 0.261 | 0.312 | 0.364 | 0.415 | 0.466 | 0.517 | 0.567 | 0.61 | 0.654 | 0.721 | 0.772 | 0.824 | 0.875 | 0.926 | 0.977 | 1.028 | 1.08 | 1.131 | 1.182 | 1.233 | 1.285 | 1.336 | 1.39 | 1.454 | 1.527 | 1.636 | 1.644 | 1.644 | 1.644 | 1.644 | 1.644 | 1.644 | 1.644 | 1.644 | 1.644 | 1.644 |
| 0.864583333333333 | 0.002 | 0.059 | 0.106 | 0.155 | 0.208 | 0.26 | 0.311 | 0.361 | 0.411 | 0.461 | 0.512 | 0.562 | 0.607 | 0.651 | 0.713 | 0.763 | 0.814 | 0.864 | 0.915 | 0.965 | 1.016 | 1.067 | 1.117 | 1.168 | 1.218 | 1.269 | 1.32 | 1.373 | 1.436 | 1.508 | 1.616 | 1.644 | 1.644 | 1.644 | 1.644 | 1.644 | 1.644 | 1.644 | 1.644 | 1.644 | 1.644 |
| 0.875 | 0.002 | 0.059 | 0.106 | 0.157 | 0.207 | 0.258 | 0.308 | 0.357 | 0.407 | 0.457 | 0.507 | 0.556 | 0.6 | 0.644 | 0.706 | 0.755 | 0.805 | 0.855 | 0.906 | 0.956 | 1.006 | 1.056 | 1.106 | 1.156 | 1.206 | 1.256 | 1.306 | 1.359 | 1.422 | 1.493 | 1.6 | 1.644 | 1.644 | 1.644 | 1.644 | 1.644 | 1.644 | 1.644 | 1.644 | 1.644 | 1.644 |
| 0.885416666666667 | 0.005 | 0.06 | 0.104 | 0.159 | 0.206 | 0.253 | 0.302 | 0.35 | 0.398 | 0.447 | 0.495 | 0.545 | 0.589 | 0.632 | 0.688 | 0.737 | 0.786 | 0.834 | 0.883 | 0.932 | 0.981 | 1.03 | 1.079 | 1.127 | 1.176 | 1.225 | 1.274 | 1.325 | 1.387 | 1.456 | 1.561 | 1.644 | 1.644 | 1.644 | 1.644 | 1.644 | 1.644 | 1.644 | 1.644 | 1.644 | 1.644 |
| 0.895833333333333 | 0.004 | 0.059 | 0.104 | 0.163 | 0.206 | 0.25 | 0.298 | 0.346 | 0.394 | 0.442 | 0.49 | 0.54 | 0.585 | 0.63 | 0.681 | 0.729 | 0.777 | 0.826 | 0.874 | 0.922 | 0.971 | 1.019 | 1.067 | 1.116 | 1.164 | 1.212 | 1.261 | 1.312 | 1.372 | 1.441 | 1.544 | 1.644 | 1.644 | 1.644 | 1.644 | 1.644 | 1.644 | 1.644 | 1.644 | 1.644 | 1.644 |
| 0.90625 | 0.008 | 0.06 | 0.106 | 0.167 | 0.208 | 0.249 | 0.296 | 0.343 | 0.39 | 0.438 | 0.485 | 0.533 | 0.58 | 0.627 | 0.673 | 0.72 | 0.768 | 0.816 | 0.864 | 0.911 | 0.959 | 1.007 | 1.055 | 1.103 | 1.15 | 1.198 | 1.246 | 1.296 | 1.356 | 1.424 | 1.526 | 1.644 | 1.644 | 1.644 | 1.644 | 1.644 | 1.644 | 1.644 | 1.644 | 1.644 | 1.644 |
| 0.916666666666667 | 0.01 | 0.06 | 0.106 | 0.17 | 0.209 | 0.248 | 0.295 | 0.342 | 0.389 | 0.436 | 0.483 | 0.529 | 0.578 | 0.627 | 0.671 | 0.718 | 0.765 | 0.813 | 0.86 | 0.908 | 0.955 | 1.003 | 1.05 | 1.098 | 1.146 | 1.193 | 1.241 | 1.291 | 1.351 | 1.418 | 1.52 | 1.644 | 1.644 | 1.644 | 1.644 | 1.644 | 1.644 | 1.644 | 1.644 | 1.644 | 1.644 |
| 0.927083333333333 | 0.002 | 0.058 | 0.11 | 0.178 | 0.22 | 0.262 | 0.313 | 0.364 | 0.415 | 0.466 | 0.517 | 0.568 | 0.626 | 0.683 | 0.721 | 0.772 | 0.823 | 0.875 | 0.926 | 0.977 | 1.028 | 1.079 | 1.13 | 1.182 | 1.233 | 1.284 | 1.335 | 1.389 | 1.453 | 1.526 | 1.636 | 1.644 | 1.644 | 1.644 | 1.644 | 1.644 | 1.644 | 1.644 | 1.644 | 1.644 | 1.644 |
| 0.9375 | 0 | 0.054 | 0.11 | 0.173 | 0.218 | 0.264 | 0.316 | 0.369 | 0.421 | 0.473 | 0.526 | 0.576 | 0.636 | 0.695 | 0.735 | 0.788 | 0.84 | 0.892 | 0.944 | 0.996 | 1.049 | 1.101 | 1.153 | 1.205 | 1.258 | 1.31 | 1.362 | 1.417 | 1.483 | 1.557 | 1.644 | 1.644 | 1.644 | 1.644 | 1.644 | 1.644 | 1.644 | 1.644 | 1.644 | 1.644 | 1.644 |
| 0.947916666666667 | 0 | 0.052 | 0.109 | 0.166 | 0.214 | 0.262 | 0.314 | 0.366 | 0.419 | 0.471 | 0.523 | 0.577 | 0.638 | 0.7 | 0.733 | 0.785 | 0.837 | 0.889 | 0.941 | 0.993 | 1.045 | 1.097 | 1.149 | 1.201 | 1.253 | 1.306 | 1.358 | 1.412 | 1.478 | 1.552 | 1.644 | 1.644 | 1.644 | 1.644 | 1.644 | 1.644 | 1.644 | 1.644 | 1.644 | 1.644 | 1.644 |
| 0.958333333333333 | 0 | 0.049 | 0.109 | 0.163 | 0.212 | 0.261 | 0.314 | 0.367 | 0.42 | 0.473 | 0.526 | 0.577 | 0.641 | 0.705 | 0.737 | 0.79 | 0.843 | 0.895 | 0.947 | 1 | 1.052 | 1.105 | 1.157 | 1.209 | 1.262 | 1.314 | 1.366 | 1.422 | 1.487 | 1.562 | 1.644 | 1.644 | 1.644 | 1.644 | 1.644 | 1.644 | 1.644 | 1.644 | 1.644 | 1.644 | 1.644 |
| 0.96875 | 0 | 0.05 | 0.109 | 0.165 | 0.214 | 0.263 | 0.316 | 0.369 | 0.422 | 0.475 | 0.528 | 0.58 | 0.645 | 0.71 | 0.74 | 0.793 | 0.845 | 0.898 | 0.95 | 1.003 | 1.055 | 1.108 | 1.161 | 1.213 | 1.266 | 1.318 | 1.371 | 1.426 | 1.492 | 1.567 | 1.644 | 1.644 | 1.644 | 1.644 | 1.644 | 1.644 | 1.644 | 1.644 | 1.644 | 1.644 | 1.644 |
| 0.979166666666667 | 0 | 0.05 | 0.112 | 0.168 | 0.218 | 0.268 | 0.322 | 0.376 | 0.431 | 0.485 | 0.539 | 0.596 | 0.661 | 0.726 | 0.756 | 0.811 | 0.864 | 0.918 | 0.972 | 1.026 | 1.079 | 1.133 | 1.187 | 1.241 | 1.294 | 1.348 | 1.402 | 1.458 | 1.526 | 1.602 | 1.644 | 1.644 | 1.644 | 1.644 | 1.644 | 1.644 | 1.644 | 1.644 | 1.644 | 1.644 | 1.644 |
| 0.989583333333333 | 0 | 0.05 | 0.113 | 0.172 | 0.22 | 0.269 | 0.324 | 0.378 | 0.433 | 0.488 | 0.542 | 0.597 | 0.666 | 0.735 | 0.761 | 0.815 | 0.87 | 0.924 | 0.978 | 1.032 | 1.086 | 1.14 | 1.194 | 1.248 | 1.302 | 1.356 | 1.41 | 1.467 | 1.535 | 1.612 | 1.644 | 1.644 | 1.644 | 1.644 | 1.644 | 1.644 | 1.644 | 1.644 | 1.644 | 1.644 | 1.644 |
| 1900-01-01 | 0 | 0.051 | 0.115 | 0.176 | 0.223 | 0.27 | 0.324 | 0.379 | 0.433 | 0.488 | 0.542 | 0.598 | 0.67 | 0.743 | 0.76 | 0.815 | 0.869 | 0.923 | 0.977 | 1.031 | 1.085 | 1.139 | 1.193 | 1.247 | 1.301 | 1.355 | 1.409 | 1.466 | 1.533 | 1.61 | 1.644 | 1.644 | 1.644 | 1.644 | 1.644 | 1.644 | 1.644 | 1.644 | 1.644 | 1.644 | 1.644 |